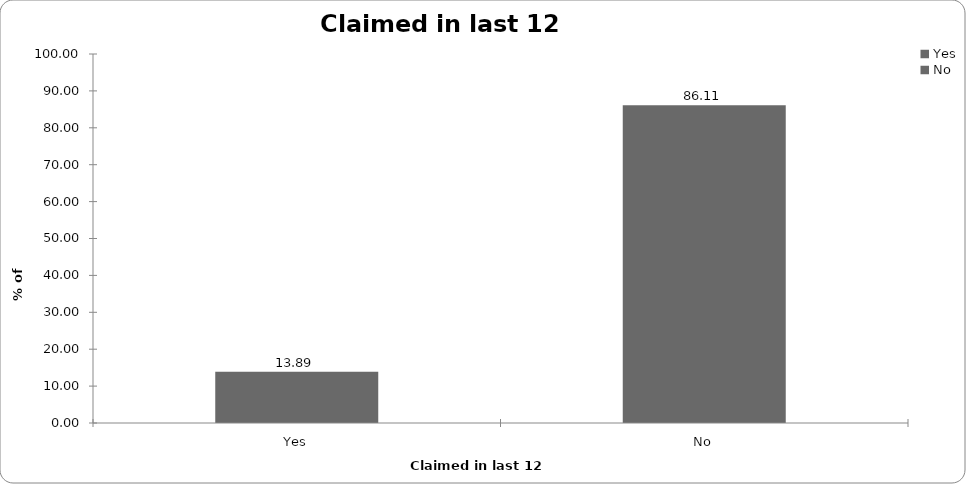
| Category | Claimed in last 12 months |
|---|---|
| Yes | 13.886 |
| No | 86.114 |